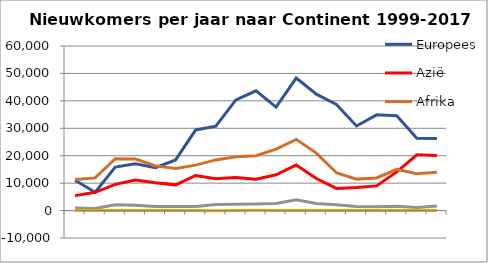
| Category | Europees | Azië | Afrika | Amerika | Oceanië |
|---|---|---|---|---|---|
| 0 | 11029 | 5451 | 11334 | 920 | 73 |
| 1 | 6666 | 6648 | 11910 | 796 | 64 |
| 2 | 15877 | 9543 | 18910 | 2099 | 37 |
| 3 | 17028 | 11105 | 18799 | 1937 | 37 |
| 4 | 15663 | 10138 | 16289 | 1477 | 42 |
| 5 | 18459 | 9376 | 15373 | 1498 | -3 |
| 6 | 29408 | 12789 | 16558 | 1493 | 24 |
| 7 | 30757 | 11608 | 18466 | 2208 | -25 |
| 8 | 40332 | 12076 | 19593 | 2309 | 48 |
| 9 | 43653 | 11419 | 19992 | 2415 | 103 |
| 10 | 37726 | 13048 | 22381 | 2616 | 19 |
| 11 | 48323 | 16610 | 25954 | 3895 | 55 |
| 12 | 42442 | 11702 | 20967 | 2584 | 58 |
| 13 | 38705 | 8087 | 13781 | 2124 | 6 |
| 14 | 30855 | 8435 | 11468 | 1483 | -7 |
| 15 | 34908 | 8996 | 11900 | 1428 | 3 |
| 16 | 34592 | 14099 | 15054 | 1556 | -7 |
| 17 | 26402 | 20332 | 13400 | 1105 | -3 |
| 18 | 26268.5 | 20075 | 13936.5 | 1704 | -2 |